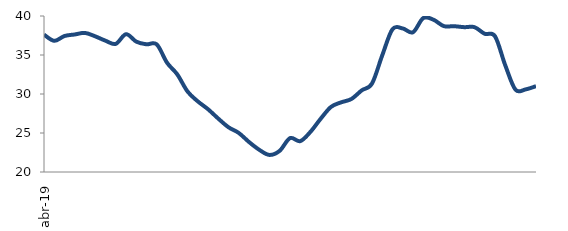
| Category | Series 0 |
|---|---|
| 2019-04-01 | 37.61 |
| 2019-05-01 | 36.815 |
| 2019-06-01 | 37.435 |
| 2019-07-01 | 37.632 |
| 2019-08-01 | 37.831 |
| 2019-09-01 | 37.39 |
| 2019-10-01 | 36.831 |
| 2019-11-01 | 36.425 |
| 2019-12-01 | 37.671 |
| 2020-01-01 | 36.714 |
| 2020-02-01 | 36.369 |
| 2020-03-01 | 36.361 |
| 2020-04-01 | 34.017 |
| 2020-05-01 | 32.52 |
| 2020-06-01 | 30.328 |
| 2020-07-01 | 29.058 |
| 2020-08-01 | 28.052 |
| 2020-09-01 | 26.848 |
| 2020-10-01 | 25.737 |
| 2020-11-01 | 25.008 |
| 2020-12-01 | 23.848 |
| 2021-01-01 | 22.846 |
| 2021-02-01 | 22.188 |
| 2021-03-01 | 22.726 |
| 2021-04-01 | 24.345 |
| 2021-05-01 | 23.958 |
| 2021-06-01 | 25.156 |
| 2021-07-01 | 26.838 |
| 2021-08-01 | 28.346 |
| 2021-09-01 | 28.934 |
| 2021-10-01 | 29.363 |
| 2021-11-01 | 30.47 |
| 2021-12-01 | 31.341 |
| 2022-01-01 | 34.958 |
| 2022-02-01 | 38.306 |
| 2022-03-01 | 38.403 |
| 2022-04-01 | 37.915 |
| 2022-05-01 | 39.735 |
| 2022-06-01 | 39.52 |
| 2022-07-01 | 38.706 |
| 2022-08-01 | 38.692 |
| 2022-09-01 | 38.568 |
| 2022-10-01 | 38.569 |
| 2022-11-01 | 37.717 |
| 2022-12-01 | 37.404 |
| 2023-01-01 | 33.684 |
| 2023-02-01 | 30.55 |
| 2023-03-01 | 30.596 |
| 2023-04-01 | 31.004 |